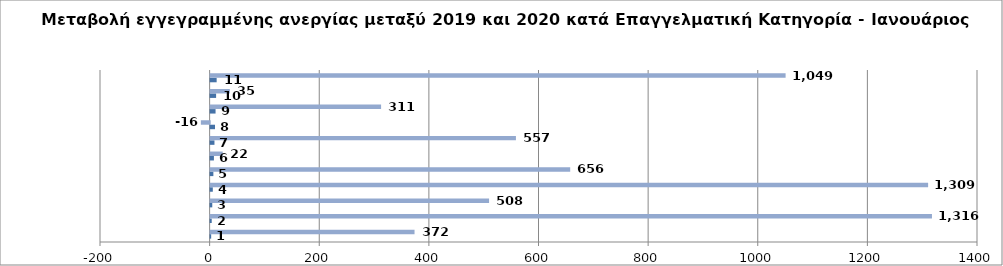
| Category | Series 0 | Series 1 |
|---|---|---|
| 0 | 1 | 372 |
| 1 | 2 | 1316 |
| 2 | 3 | 508 |
| 3 | 4 | 1309 |
| 4 | 5 | 656 |
| 5 | 6 | 22 |
| 6 | 7 | 557 |
| 7 | 8 | -16 |
| 8 | 9 | 311 |
| 9 | 10 | 35 |
| 10 | 11 | 1049 |